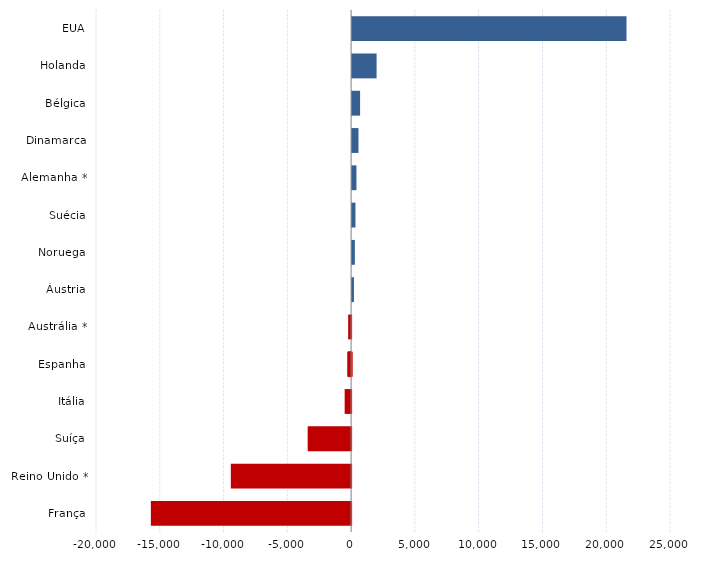
| Category | Series 0 |
|---|---|
| França | -15700 |
| Reino Unido * | -9431 |
| Suíça | -3404 |
| Itália | -506 |
| Espanha | -281 |
| Austrália * | -230 |
| Áustria | 143 |
| Noruega | 215 |
| Suécia | 262 |
| Alemanha * | 340 |
| Dinamarca | 500 |
| Bélgica | 625 |
| Holanda | 1919 |
| EUA | 21512 |